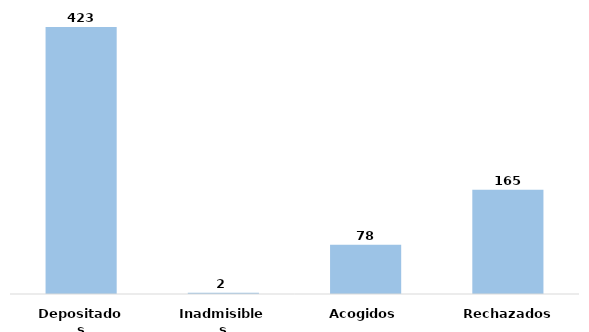
| Category | Series 0 |
|---|---|
| Depositados | 423 |
| Inadmisibles | 2 |
| Acogidos | 78 |
| Rechazados | 165 |